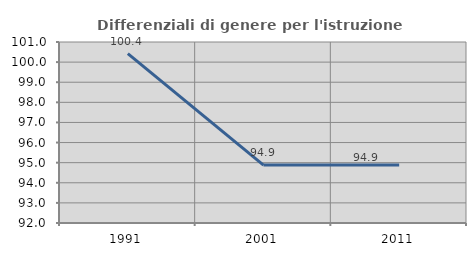
| Category | Differenziali di genere per l'istruzione superiore |
|---|---|
| 1991.0 | 100.423 |
| 2001.0 | 94.882 |
| 2011.0 | 94.887 |